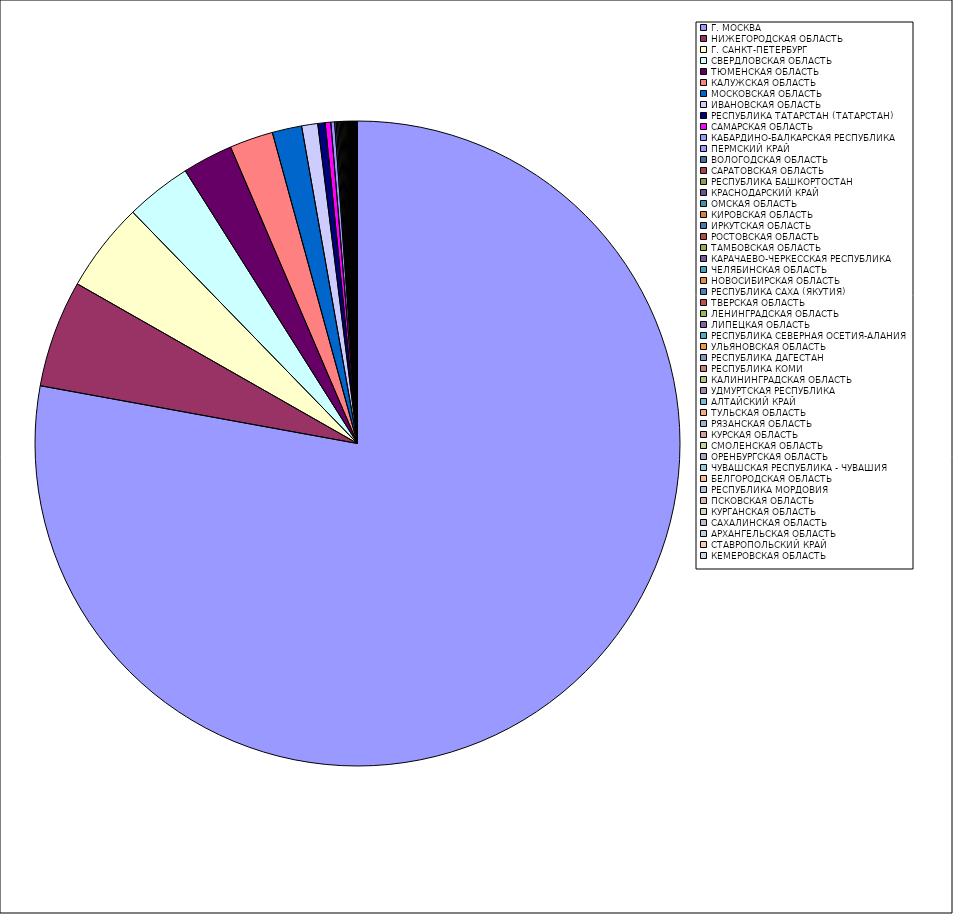
| Category | Оборот |
|---|---|
| Г. МОСКВА | 77.846 |
| НИЖЕГОРОДСКАЯ ОБЛАСТЬ | 5.373 |
| Г. САНКТ-ПЕТЕРБУРГ | 4.485 |
| СВЕРДЛОВСКАЯ ОБЛАСТЬ | 3.305 |
| ТЮМЕНСКАЯ ОБЛАСТЬ | 2.526 |
| КАЛУЖСКАЯ ОБЛАСТЬ | 2.184 |
| МОСКОВСКАЯ ОБЛАСТЬ | 1.478 |
| ИВАНОВСКАЯ ОБЛАСТЬ | 0.806 |
| РЕСПУБЛИКА ТАТАРСТАН (ТАТАРСТАН) | 0.369 |
| САМАРСКАЯ ОБЛАСТЬ | 0.279 |
| КАБАРДИНО-БАЛКАРСКАЯ РЕСПУБЛИКА | 0.189 |
| ПЕРМСКИЙ КРАЙ | 0.072 |
| ВОЛОГОДСКАЯ ОБЛАСТЬ | 0.069 |
| САРАТОВСКАЯ ОБЛАСТЬ | 0.068 |
| РЕСПУБЛИКА БАШКОРТОСТАН | 0.061 |
| КРАСНОДАРСКИЙ КРАЙ | 0.058 |
| ОМСКАЯ ОБЛАСТЬ | 0.057 |
| КИРОВСКАЯ ОБЛАСТЬ | 0.055 |
| ИРКУТСКАЯ ОБЛАСТЬ | 0.055 |
| РОСТОВСКАЯ ОБЛАСТЬ | 0.053 |
| ТАМБОВСКАЯ ОБЛАСТЬ | 0.051 |
| КАРАЧАЕВО-ЧЕРКЕССКАЯ РЕСПУБЛИКА | 0.038 |
| ЧЕЛЯБИНСКАЯ ОБЛАСТЬ | 0.037 |
| НОВОСИБИРСКАЯ ОБЛАСТЬ | 0.036 |
| РЕСПУБЛИКА САХА (ЯКУТИЯ) | 0.036 |
| ТВЕРСКАЯ ОБЛАСТЬ | 0.032 |
| ЛЕНИНГРАДСКАЯ ОБЛАСТЬ | 0.029 |
| ЛИПЕЦКАЯ ОБЛАСТЬ | 0.028 |
| РЕСПУБЛИКА СЕВЕРНАЯ ОСЕТИЯ-АЛАНИЯ | 0.025 |
| УЛЬЯНОВСКАЯ ОБЛАСТЬ | 0.025 |
| РЕСПУБЛИКА ДАГЕСТАН | 0.024 |
| РЕСПУБЛИКА КОМИ | 0.023 |
| КАЛИНИНГРАДСКАЯ ОБЛАСТЬ | 0.022 |
| УДМУРТСКАЯ РЕСПУБЛИКА | 0.021 |
| АЛТАЙСКИЙ КРАЙ | 0.019 |
| ТУЛЬСКАЯ ОБЛАСТЬ | 0.016 |
| РЯЗАНСКАЯ ОБЛАСТЬ | 0.014 |
| КУРСКАЯ ОБЛАСТЬ | 0.014 |
| СМОЛЕНСКАЯ ОБЛАСТЬ | 0.014 |
| ОРЕНБУРГСКАЯ ОБЛАСТЬ | 0.012 |
| ЧУВАШСКАЯ РЕСПУБЛИКА - ЧУВАШИЯ | 0.011 |
| БЕЛГОРОДСКАЯ ОБЛАСТЬ | 0.01 |
| РЕСПУБЛИКА МОРДОВИЯ | 0.01 |
| ПСКОВСКАЯ ОБЛАСТЬ | 0.008 |
| КУРГАНСКАЯ ОБЛАСТЬ | 0.007 |
| САХАЛИНСКАЯ ОБЛАСТЬ | 0.006 |
| АРХАНГЕЛЬСКАЯ ОБЛАСТЬ | 0.006 |
| СТАВРОПОЛЬСКИЙ КРАЙ | 0.005 |
| КЕМЕРОВСКАЯ ОБЛАСТЬ | 0.005 |